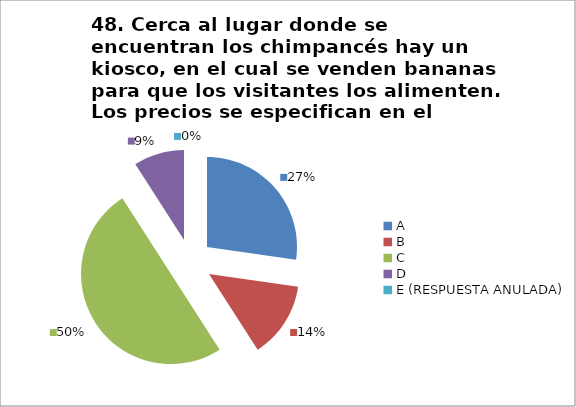
| Category | CANTIDAD DE RESPUESTAS PREGUNTA (48) | PORCENTAJE |
|---|---|---|
| A | 6 | 0.273 |
| B | 3 | 0.136 |
| C | 11 | 0.5 |
| D | 2 | 0.091 |
| E (RESPUESTA ANULADA) | 0 | 0 |